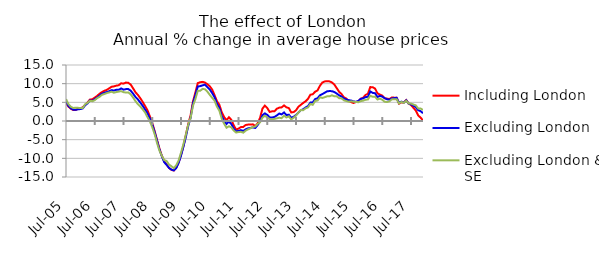
| Category | Including London | Excluding London | Excluding London & SE |
|---|---|---|---|
| 2005-07-01 | 4.868 | 5.188 | 5.873 |
| 2005-08-01 | 3.867 | 4.08 | 4.554 |
| 2005-09-01 | 3.287 | 3.441 | 3.817 |
| 2005-10-01 | 2.957 | 3.025 | 3.474 |
| 2005-11-01 | 2.936 | 2.983 | 3.57 |
| 2005-12-01 | 3.279 | 3.129 | 3.52 |
| 2006-01-01 | 3.389 | 3.202 | 3.495 |
| 2006-02-01 | 3.672 | 3.369 | 3.487 |
| 2006-03-01 | 4.318 | 4.224 | 4.491 |
| 2006-04-01 | 4.97 | 4.74 | 4.882 |
| 2006-05-01 | 5.753 | 5.508 | 5.407 |
| 2006-06-01 | 5.816 | 5.413 | 5.307 |
| 2006-07-01 | 6.266 | 5.862 | 5.572 |
| 2006-08-01 | 6.724 | 6.273 | 6.125 |
| 2006-09-01 | 7.303 | 6.796 | 6.488 |
| 2006-10-01 | 7.739 | 7.311 | 7.012 |
| 2006-11-01 | 8.092 | 7.552 | 7.228 |
| 2006-12-01 | 8.328 | 7.744 | 7.479 |
| 2007-01-01 | 8.744 | 7.938 | 7.648 |
| 2007-02-01 | 9.166 | 8.264 | 7.844 |
| 2007-03-01 | 9.273 | 8.16 | 7.585 |
| 2007-04-01 | 9.473 | 8.365 | 7.752 |
| 2007-05-01 | 9.571 | 8.36 | 7.869 |
| 2007-06-01 | 10.104 | 8.712 | 7.995 |
| 2007-07-01 | 10.009 | 8.393 | 7.73 |
| 2007-08-01 | 10.291 | 8.542 | 7.611 |
| 2007-09-01 | 10.223 | 8.548 | 7.654 |
| 2007-10-01 | 9.763 | 8.119 | 7.135 |
| 2007-11-01 | 8.751 | 7.333 | 6.276 |
| 2007-12-01 | 7.697 | 6.431 | 5.321 |
| 2008-01-01 | 6.986 | 5.776 | 4.509 |
| 2008-02-01 | 6.111 | 4.946 | 3.888 |
| 2008-03-01 | 5.116 | 4.077 | 3.121 |
| 2008-04-01 | 4.02 | 3.081 | 2.293 |
| 2008-05-01 | 2.875 | 2.048 | 1.052 |
| 2008-06-01 | 1.262 | 0.647 | -0.097 |
| 2008-07-01 | -0.533 | -0.926 | -1.64 |
| 2008-08-01 | -2.725 | -2.997 | -3.515 |
| 2008-09-01 | -5.104 | -5.303 | -5.87 |
| 2008-10-01 | -7.376 | -7.608 | -7.937 |
| 2008-11-01 | -9.297 | -9.455 | -9.335 |
| 2008-12-01 | -10.8 | -11.056 | -10.464 |
| 2009-01-01 | -11.668 | -11.732 | -10.716 |
| 2009-02-01 | -12.574 | -12.567 | -11.666 |
| 2009-03-01 | -13.084 | -13.028 | -12.121 |
| 2009-04-01 | -13.266 | -13.226 | -12.645 |
| 2009-05-01 | -12.502 | -12.63 | -11.85 |
| 2009-06-01 | -11.111 | -11.222 | -10.567 |
| 2009-07-01 | -9.069 | -9.268 | -8.5 |
| 2009-08-01 | -6.73 | -6.891 | -6.233 |
| 2009-09-01 | -3.841 | -4.315 | -3.725 |
| 2009-10-01 | -0.891 | -1.338 | -1.052 |
| 2009-11-01 | 1.527 | 0.866 | 0.835 |
| 2009-12-01 | 5.213 | 4.74 | 4.097 |
| 2010-01-01 | 7.638 | 6.917 | 5.894 |
| 2010-02-01 | 10.146 | 9.242 | 8.08 |
| 2010-03-01 | 10.391 | 9.336 | 8.097 |
| 2010-04-01 | 10.483 | 9.55 | 8.596 |
| 2010-05-01 | 10.298 | 9.736 | 8.498 |
| 2010-06-01 | 9.859 | 9.067 | 7.875 |
| 2010-07-01 | 9.305 | 8.452 | 6.997 |
| 2010-08-01 | 8.428 | 7.472 | 6.217 |
| 2010-09-01 | 6.93 | 6.389 | 5.449 |
| 2010-10-01 | 5.294 | 4.629 | 3.856 |
| 2010-11-01 | 4.366 | 3.567 | 2.77 |
| 2010-12-01 | 2.351 | 1.291 | 0.62 |
| 2011-01-01 | 1.072 | 0.094 | -0.744 |
| 2011-02-01 | 0.208 | -0.804 | -1.808 |
| 2011-03-01 | 1.006 | -0.124 | -1.409 |
| 2011-04-01 | 0.331 | -0.809 | -1.693 |
| 2011-05-01 | -1.145 | -2.048 | -2.556 |
| 2011-06-01 | -2.283 | -2.772 | -3.087 |
| 2011-07-01 | -2.048 | -2.656 | -2.969 |
| 2011-08-01 | -1.628 | -2.443 | -2.895 |
| 2011-09-01 | -1.581 | -2.674 | -3.134 |
| 2011-10-01 | -1.066 | -2.222 | -2.576 |
| 2011-11-01 | -0.96 | -1.963 | -2.232 |
| 2011-12-01 | -0.953 | -1.857 | -1.948 |
| 2012-01-01 | -0.894 | -1.693 | -1.611 |
| 2012-02-01 | -1.359 | -1.871 | -1.47 |
| 2012-03-01 | -0.614 | -1.091 | -0.769 |
| 2012-04-01 | 0.86 | -0.091 | -0.35 |
| 2012-05-01 | 3.334 | 1.549 | 0.923 |
| 2012-06-01 | 4.128 | 2.044 | 1.388 |
| 2012-07-01 | 3.47 | 1.636 | 0.983 |
| 2012-08-01 | 2.434 | 0.982 | 0.52 |
| 2012-09-01 | 2.586 | 0.94 | 0.391 |
| 2012-10-01 | 2.602 | 1.082 | 0.57 |
| 2012-11-01 | 3.287 | 1.492 | 0.709 |
| 2012-12-01 | 3.577 | 1.996 | 0.875 |
| 2013-01-01 | 3.648 | 1.78 | 0.757 |
| 2013-02-01 | 4.174 | 2.291 | 1.403 |
| 2013-03-01 | 3.663 | 1.587 | 0.943 |
| 2013-04-01 | 3.466 | 1.698 | 1.261 |
| 2013-05-01 | 2.291 | 0.882 | 0.426 |
| 2013-06-01 | 2.393 | 1.119 | 0.868 |
| 2013-07-01 | 2.858 | 1.61 | 1.48 |
| 2013-08-01 | 3.814 | 2.261 | 2.244 |
| 2013-09-01 | 4.333 | 2.871 | 2.933 |
| 2013-10-01 | 4.836 | 3.156 | 2.901 |
| 2013-11-01 | 5.271 | 3.613 | 3.403 |
| 2013-12-01 | 5.931 | 3.982 | 3.631 |
| 2014-01-01 | 7.043 | 4.93 | 4.559 |
| 2014-02-01 | 7.17 | 4.995 | 4.338 |
| 2014-03-01 | 7.861 | 5.881 | 5.371 |
| 2014-04-01 | 8.195 | 6.091 | 5.489 |
| 2014-05-01 | 9.454 | 6.896 | 6.364 |
| 2014-06-01 | 10.318 | 7.206 | 6.171 |
| 2014-07-01 | 10.597 | 7.58 | 6.388 |
| 2014-08-01 | 10.678 | 7.955 | 6.618 |
| 2014-09-01 | 10.61 | 8.024 | 6.621 |
| 2014-10-01 | 10.323 | 7.989 | 6.88 |
| 2014-11-01 | 9.763 | 7.763 | 6.632 |
| 2014-12-01 | 8.797 | 7.348 | 6.61 |
| 2015-01-01 | 7.813 | 6.877 | 6.119 |
| 2015-02-01 | 7.224 | 6.559 | 6.085 |
| 2015-03-01 | 6.33 | 6.024 | 5.533 |
| 2015-04-01 | 6.023 | 5.773 | 5.347 |
| 2015-05-01 | 5.366 | 5.563 | 5.154 |
| 2015-06-01 | 5.058 | 5.479 | 5.276 |
| 2015-07-01 | 4.827 | 5.238 | 5.179 |
| 2015-08-01 | 5.088 | 5.157 | 5.099 |
| 2015-09-01 | 5.256 | 5.36 | 5.04 |
| 2015-10-01 | 5.973 | 5.921 | 5.319 |
| 2015-11-01 | 6.226 | 6.046 | 5.447 |
| 2015-12-01 | 6.98 | 6.391 | 5.676 |
| 2016-01-01 | 7.302 | 6.488 | 5.77 |
| 2016-02-01 | 9.082 | 7.913 | 6.754 |
| 2016-03-01 | 9.049 | 7.533 | 6.499 |
| 2016-04-01 | 8.69 | 7.44 | 6.5 |
| 2016-05-01 | 7.419 | 6.425 | 5.763 |
| 2016-06-01 | 7.079 | 6.729 | 5.985 |
| 2016-07-01 | 6.797 | 6.532 | 5.694 |
| 2016-08-01 | 6.084 | 6.117 | 5.154 |
| 2016-09-01 | 5.995 | 5.816 | 5.069 |
| 2016-10-01 | 5.867 | 5.708 | 5.283 |
| 2016-11-01 | 6.297 | 6.046 | 5.797 |
| 2016-12-01 | 6.258 | 6.129 | 5.848 |
| 2017-01-01 | 6.221 | 6.232 | 5.84 |
| 2017-02-01 | 4.638 | 4.817 | 4.697 |
| 2017-03-01 | 4.993 | 5.185 | 5.121 |
| 2017-04-01 | 4.97 | 4.936 | 4.865 |
| 2017-05-01 | 5.604 | 5.537 | 5.396 |
| 2017-06-01 | 4.65 | 4.664 | 4.694 |
| 2017-07-01 | 4.283 | 4.457 | 4.663 |
| 2017-08-01 | 3.529 | 4.099 | 4.414 |
| 2017-09-01 | 2.79 | 3.712 | 4.175 |
| 2017-10-01 | 1.49 | 2.885 | 3.343 |
| 2017-11-01 | 0.893 | 2.634 | 3.339 |
| 2017-12-01 | 0.184 | 2.09 | 2.967 |